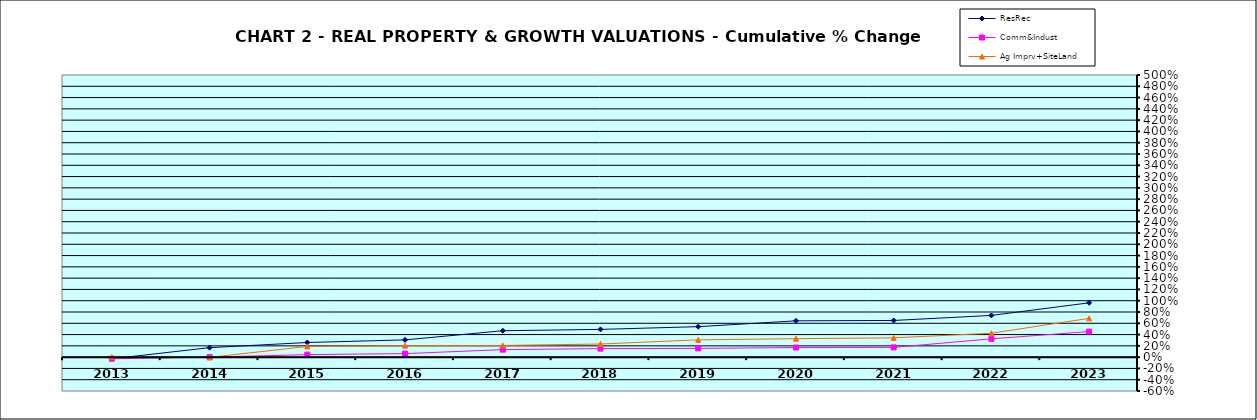
| Category | ResRec | Comm&Indust | Ag Imprv+SiteLand |
|---|---|---|---|
| 2013.0 | -0.029 | -0.028 | 0 |
| 2014.0 | 0.168 | 0 | -0.005 |
| 2015.0 | 0.259 | 0.044 | 0.19 |
| 2016.0 | 0.306 | 0.062 | 0.204 |
| 2017.0 | 0.468 | 0.133 | 0.206 |
| 2018.0 | 0.492 | 0.151 | 0.233 |
| 2019.0 | 0.54 | 0.155 | 0.307 |
| 2020.0 | 0.643 | 0.17 | 0.327 |
| 2021.0 | 0.65 | 0.173 | 0.342 |
| 2022.0 | 0.739 | 0.324 | 0.424 |
| 2023.0 | 0.963 | 0.453 | 0.687 |